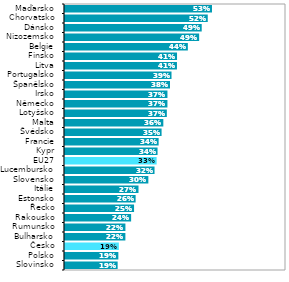
| Category | Series 1 |
|---|---|
| Slovinsko | 0.191 |
| Polsko | 0.193 |
| Česko | 0.195 |
| Bulharsko | 0.219 |
| Rumunsko | 0.219 |
| Rakousko | 0.239 |
| Řecko | 0.25 |
| Estonsko | 0.256 |
| Itálie | 0.266 |
| Slovensko | 0.302 |
| Lucembursko | 0.324 |
| EU27 | 0.332 |
| Kypr | 0.335 |
| Francie | 0.339 |
| Švédsko | 0.35 |
| Malta | 0.356 |
| Lotyšsko | 0.369 |
| Německo | 0.371 |
| Irsko | 0.371 |
| Španělsko | 0.38 |
| Portugalsko | 0.386 |
| Litva | 0.405 |
| Finsko | 0.406 |
| Belgie | 0.445 |
| Nizozemsko | 0.486 |
| Dánsko | 0.495 |
| Chorvatsko | 0.517 |
| Maďarsko | 0.532 |